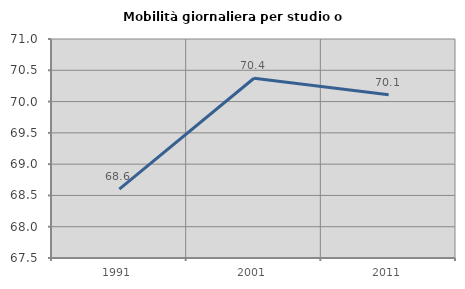
| Category | Mobilità giornaliera per studio o lavoro |
|---|---|
| 1991.0 | 68.601 |
| 2001.0 | 70.373 |
| 2011.0 | 70.109 |